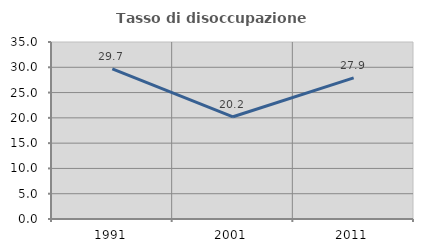
| Category | Tasso di disoccupazione giovanile  |
|---|---|
| 1991.0 | 29.674 |
| 2001.0 | 20.211 |
| 2011.0 | 27.902 |